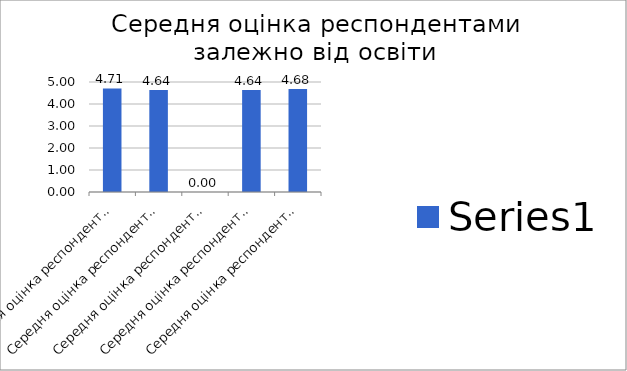
| Category | Series 0 |
|---|---|
| Середня оцінка респондентами з середньою та неповною середньою освітою  | 4.706 |
| Середня оцінка респондентами з вищою та неповною вищою освітою  | 4.64 |
| Середня оцінка респондентами, які мають іншу освіту  | 0 |
| Середня оцінка респондентами, які мають вищу юридичну освіту | 4.636 |
| Середня оцінка респондентами, які не мають вищої юридичної освіти | 4.677 |